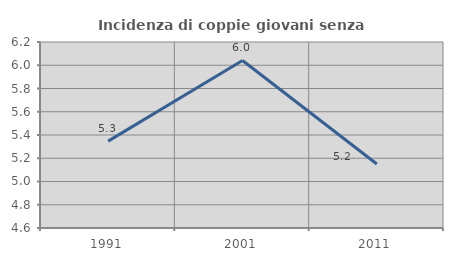
| Category | Incidenza di coppie giovani senza figli |
|---|---|
| 1991.0 | 5.348 |
| 2001.0 | 6.041 |
| 2011.0 | 5.151 |